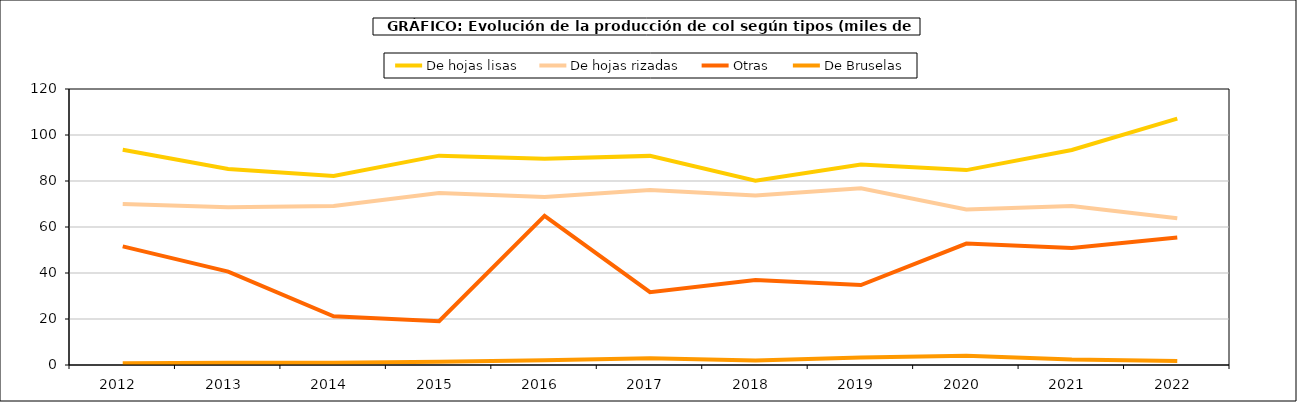
| Category | De hojas lisas | De hojas rizadas | Otras | De Bruselas |
|---|---|---|---|---|
| 2012.0 | 93.549 | 70.008 | 51.596 | 0.731 |
| 2013.0 | 85.207 | 68.536 | 40.593 | 0.965 |
| 2014.0 | 82.165 | 69.098 | 21.166 | 1.025 |
| 2015.0 | 91.025 | 74.746 | 19.06 | 1.371 |
| 2016.0 | 89.719 | 73.058 | 64.818 | 2.023 |
| 2017.0 | 90.922 | 76.042 | 31.66 | 2.985 |
| 2018.0 | 80.113 | 73.721 | 36.915 | 1.984 |
| 2019.0 | 87.207 | 76.809 | 34.763 | 3.306 |
| 2020.0 | 84.743 | 67.663 | 52.8 | 4.02 |
| 2021.0 | 93.471 | 69.125 | 50.826 | 2.339 |
| 2022.0 | 107.147 | 63.825 | 55.419 | 1.745 |